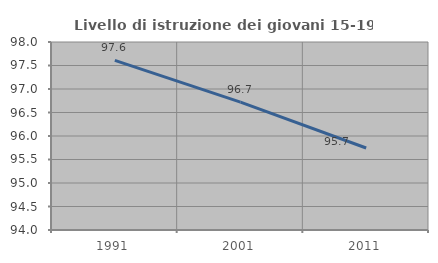
| Category | Livello di istruzione dei giovani 15-19 anni |
|---|---|
| 1991.0 | 97.61 |
| 2001.0 | 96.721 |
| 2011.0 | 95.745 |